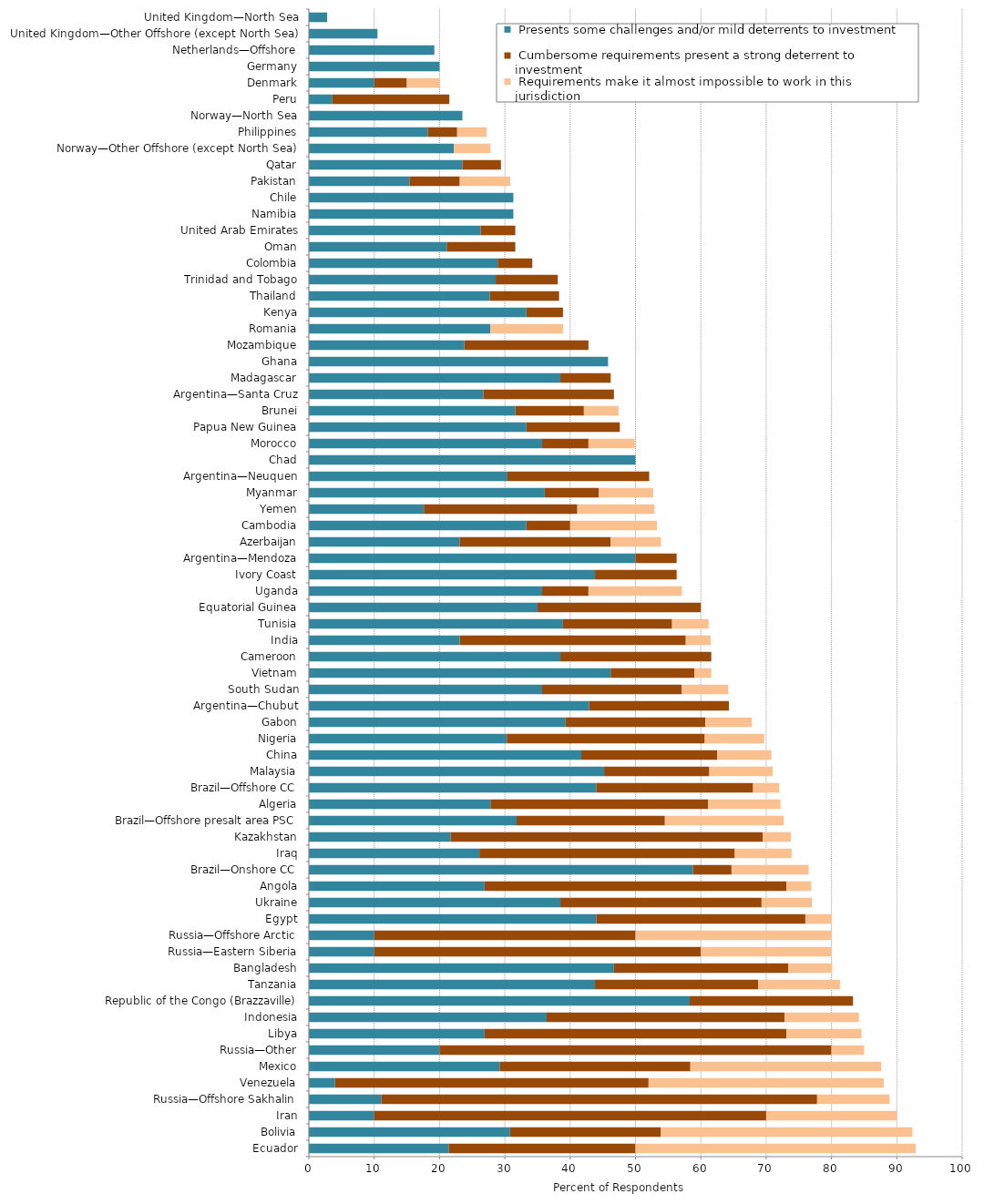
| Category |  Presents some challenges and/or mild deterrents to investment |  Cumbersome requirements present a strong deterrent to investment |  Requirements make it almost impossible to work in this jurisdiction |
|---|---|---|---|
| Ecuador | 21.4 | 28.6 | 42.9 |
| Bolivia | 30.8 | 23.1 | 38.5 |
| Iran | 10 | 60 | 20 |
| Russia—Offshore Sakhalin | 11.1 | 66.7 | 11.1 |
| Venezuela | 4 | 48 | 36 |
| Mexico | 29.2 | 29.2 | 29.2 |
| Russia—Other | 20 | 60 | 5 |
| Libya | 26.9 | 46.2 | 11.5 |
| Indonesia | 36.4 | 36.4 | 11.4 |
| Republic of the Congo (Brazzaville) | 58.3 | 25 | 0 |
| Tanzania | 43.8 | 25 | 12.5 |
| Bangladesh | 46.7 | 26.7 | 6.7 |
| Russia—Eastern Siberia | 10 | 50 | 20 |
| Russia—Offshore Arctic | 10 | 40 | 30 |
| Egypt | 44 | 32 | 4 |
| Ukraine | 38.5 | 30.8 | 7.7 |
| Angola | 26.9 | 46.2 | 3.8 |
| Brazil—Onshore CC | 58.8 | 5.9 | 11.8 |
| Iraq | 26.1 | 39.1 | 8.7 |
| Kazakhstan | 21.7 | 47.8 | 4.3 |
| Brazil—Offshore presalt area PSC | 31.8 | 22.7 | 18.2 |
| Algeria | 27.8 | 33.3 | 11.1 |
| Brazil—Offshore CC | 44 | 24 | 4 |
| Malaysia | 45.2 | 16.1 | 9.7 |
| China | 41.7 | 20.8 | 8.3 |
| Nigeria | 30.3 | 30.3 | 9.1 |
| Gabon | 39.3 | 21.4 | 7.1 |
| Argentina—Chubut | 42.9 | 21.4 | 0 |
| South Sudan | 35.7 | 21.4 | 7.1 |
| Vietnam | 46.2 | 12.8 | 2.6 |
| Cameroon | 38.5 | 23.1 | 0 |
| India | 23.1 | 34.6 | 3.8 |
| Tunisia | 38.9 | 16.7 | 5.6 |
| Equatorial Guinea | 35 | 25 | 0 |
| Uganda | 35.7 | 7.1 | 14.3 |
| Ivory Coast | 43.8 | 12.5 | 0 |
| Argentina—Mendoza | 50 | 6.3 | 0 |
| Azerbaijan | 23.1 | 23.1 | 7.7 |
| Cambodia | 33.3 | 6.7 | 13.3 |
| Yemen | 17.6 | 23.5 | 11.8 |
| Myanmar | 36.1 | 8.3 | 8.3 |
| Argentina—Neuquen | 30.4 | 21.7 | 0 |
| Chad | 50 | 0 | 0 |
| Morocco | 35.7 | 7.1 | 7.1 |
| Papua New Guinea | 33.3 | 14.3 | 0 |
| Brunei | 31.6 | 10.5 | 5.3 |
| Argentina—Santa Cruz | 26.7 | 20 | 0 |
| Madagascar | 38.5 | 7.7 | 0 |
| Ghana | 45.8 | 0 | 0 |
| Mozambique | 23.8 | 19 | 0 |
| Romania | 27.8 | 0 | 11.1 |
| Kenya | 33.3 | 5.6 | 0 |
| Thailand | 27.7 | 10.6 | 0 |
| Trinidad and Tobago | 28.6 | 9.5 | 0 |
| Colombia | 28.9 | 5.3 | 0 |
| Oman | 21.1 | 10.5 | 0 |
| United Arab Emirates | 26.3 | 5.3 | 0 |
| Namibia | 31.3 | 0 | 0 |
| Chile | 31.3 | 0 | 0 |
| Pakistan | 15.4 | 7.7 | 7.7 |
| Qatar | 23.5 | 5.9 | 0 |
| Norway—Other Offshore (except North Sea) | 22.2 | 0 | 5.6 |
| Philippines | 18.2 | 4.5 | 4.5 |
| Norway—North Sea | 23.5 | 0 | 0 |
| Peru | 3.6 | 17.9 | 0 |
| Denmark | 10 | 5 | 5 |
| Germany | 20 | 0 | 0 |
| Netherlands—Offshore | 19.2 | 0 | 0 |
| United Kingdom—Other Offshore (except North Sea) | 10.5 | 0 | 0 |
| United Kingdom—North Sea | 2.8 | 0 | 0 |